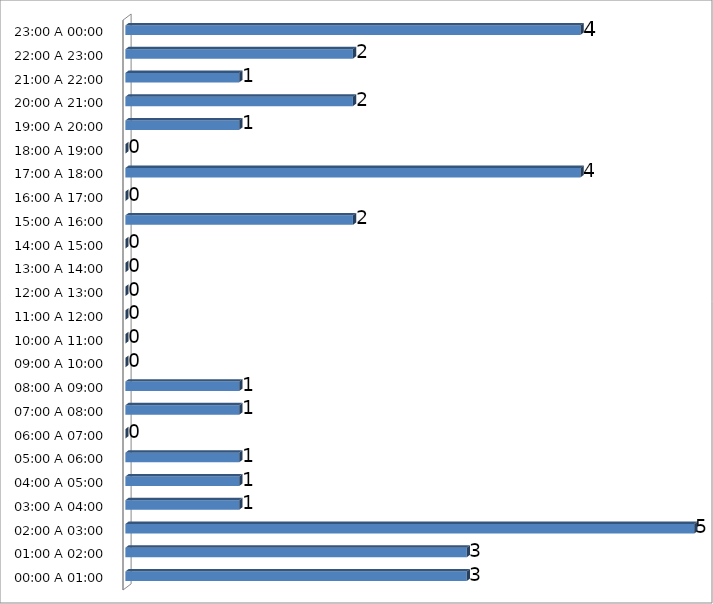
| Category | Series 0 |
|---|---|
| 00:00 A 01:00 | 3 |
| 01:00 A 02:00 | 3 |
| 02:00 A 03:00 | 5 |
| 03:00 A 04:00 | 1 |
| 04:00 A 05:00 | 1 |
| 05:00 A 06:00 | 1 |
| 06:00 A 07:00 | 0 |
| 07:00 A 08:00 | 1 |
| 08:00 A 09:00 | 1 |
| 09:00 A 10:00 | 0 |
| 10:00 A 11:00 | 0 |
| 11:00 A 12:00 | 0 |
| 12:00 A 13:00 | 0 |
| 13:00 A 14:00 | 0 |
| 14:00 A 15:00 | 0 |
| 15:00 A 16:00 | 2 |
| 16:00 A 17:00 | 0 |
| 17:00 A 18:00 | 4 |
| 18:00 A 19:00 | 0 |
| 19:00 A 20:00 | 1 |
| 20:00 A 21:00 | 2 |
| 21:00 A 22:00 | 1 |
| 22:00 A 23:00 | 2 |
| 23:00 A 00:00 | 4 |